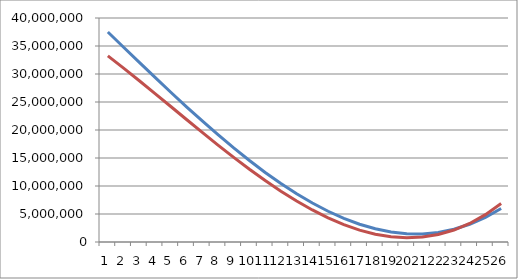
| Category | Series 0 | Series 1 |
|---|---|---|
| 0 | 37492793.97 | 33233643.01 |
| 1 | 34784448.56 | 31049863.84 |
| 2 | 32080432.79 | 28801404.03 |
| 3 | 29395915.68 | 26508970 |
| 4 | 26746066.25 | 24193268.17 |
| 5 | 24146053.52 | 21875004.96 |
| 6 | 21611046.51 | 19574886.79 |
| 7 | 19156214.24 | 17313620.08 |
| 8 | 16796725.73 | 15111911.25 |
| 9 | 14547750 | 12990466.72 |
| 10 | 12424456.07 | 10969992.91 |
| 11 | 10442012.96 | 9071196.24 |
| 12 | 8615589.69 | 7314783.13 |
| 13 | 6960355.28 | 5721460 |
| 14 | 5491478.75 | 4311933.27 |
| 15 | 4224129.12 | 3106909.36 |
| 16 | 3173475.41 | 2127094.69 |
| 17 | 2354686.64 | 1393195.68 |
| 18 | 1782931.83 | 925918.75 |
| 19 | 1473380 | 745970.32 |
| 20 | 1441200.17 | 874056.81 |
| 21 | 1701561.36 | 1330884.64 |
| 22 | 2269632.59 | 2137160.23 |
| 23 | 3160582.88 | 3313590 |
| 24 | 4389581.25 | 4880880.37 |
| 25 | 5971796.72 | 6859737.76 |